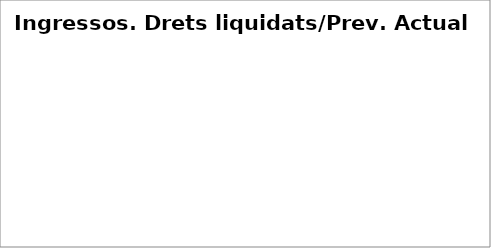
| Category | Series 0 |
|---|---|
| Impostos directes | 1.125 |
| Impostos indirectes | 1.185 |
| Taxes, preus públics i altres ingressos | 1.226 |
| Transferències corrents | 0.981 |
| Ingressos patrimonials | 0.951 |
| Venda d'inversions reals | 23.819 |
| Transferències de capital | 2.006 |
| Actius financers* | 0.034 |
| Passius financers | 0.573 |